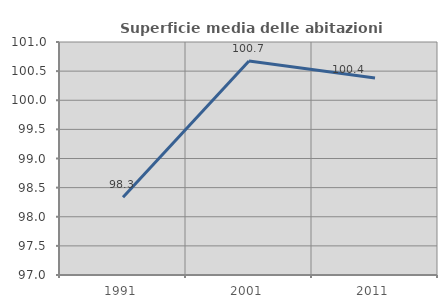
| Category | Superficie media delle abitazioni occupate |
|---|---|
| 1991.0 | 98.334 |
| 2001.0 | 100.675 |
| 2011.0 | 100.383 |